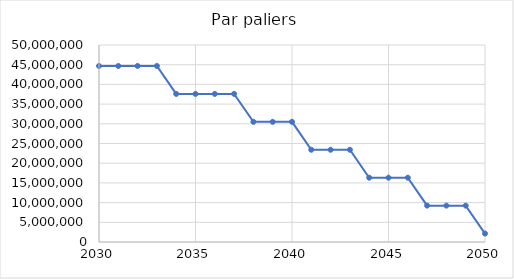
| Category | Emissions (t eqCO2) |
|---|---|
| 2030.0 | 44677380 |
| 2031.0 | 44677380 |
| 2032.0 | 44677380 |
| 2033.0 | 44677380 |
| 2034.0 | 37588283.333 |
| 2035.0 | 37588283.333 |
| 2036.0 | 37588283.333 |
| 2037.0 | 37588283.333 |
| 2038.0 | 30499186.667 |
| 2039.0 | 30499186.667 |
| 2040.0 | 30499186.667 |
| 2041.0 | 23410090 |
| 2042.0 | 23410090 |
| 2043.0 | 23410090 |
| 2044.0 | 16320993.333 |
| 2045.0 | 16320993.333 |
| 2046.0 | 16320993.333 |
| 2047.0 | 9231896.667 |
| 2048.0 | 9231896.667 |
| 2049.0 | 9231896.667 |
| 2050.0 | 2142800 |